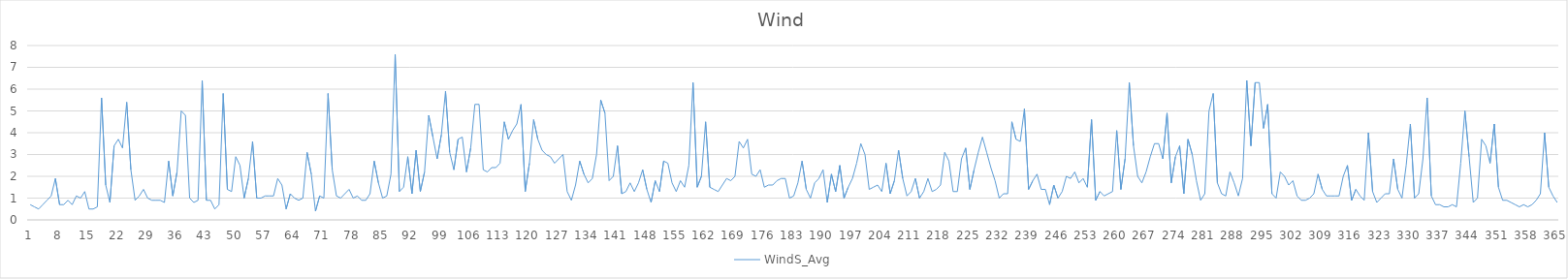
| Category | WindS_Avg |
|---|---|
| 0 | 0.7 |
| 1 | 0.6 |
| 2 | 0.5 |
| 3 | 0.7 |
| 4 | 0.9 |
| 5 | 1.1 |
| 6 | 1.9 |
| 7 | 0.7 |
| 8 | 0.7 |
| 9 | 0.9 |
| 10 | 0.7 |
| 11 | 1.1 |
| 12 | 1 |
| 13 | 1.3 |
| 14 | 0.5 |
| 15 | 0.5 |
| 16 | 0.6 |
| 17 | 5.6 |
| 18 | 1.6 |
| 19 | 0.8 |
| 20 | 3.4 |
| 21 | 3.7 |
| 22 | 3.3 |
| 23 | 5.4 |
| 24 | 2.3 |
| 25 | 0.9 |
| 26 | 1.1 |
| 27 | 1.4 |
| 28 | 1 |
| 29 | 0.9 |
| 30 | 0.9 |
| 31 | 0.9 |
| 32 | 0.8 |
| 33 | 2.7 |
| 34 | 1.1 |
| 35 | 2.2 |
| 36 | 5 |
| 37 | 4.8 |
| 38 | 1 |
| 39 | 0.8 |
| 40 | 0.9 |
| 41 | 6.4 |
| 42 | 0.9 |
| 43 | 0.9 |
| 44 | 0.5 |
| 45 | 0.7 |
| 46 | 5.8 |
| 47 | 1.4 |
| 48 | 1.3 |
| 49 | 2.9 |
| 50 | 2.5 |
| 51 | 1 |
| 52 | 1.9 |
| 53 | 3.6 |
| 54 | 1 |
| 55 | 1 |
| 56 | 1.1 |
| 57 | 1.1 |
| 58 | 1.1 |
| 59 | 1.9 |
| 60 | 1.6 |
| 61 | 0.5 |
| 62 | 1.2 |
| 63 | 1 |
| 64 | 0.9 |
| 65 | 1 |
| 66 | 3.1 |
| 67 | 2.1 |
| 68 | 0.4 |
| 69 | 1.1 |
| 70 | 1 |
| 71 | 5.8 |
| 72 | 2.3 |
| 73 | 1.1 |
| 74 | 1 |
| 75 | 1.2 |
| 76 | 1.4 |
| 77 | 1 |
| 78 | 1.1 |
| 79 | 0.9 |
| 80 | 0.9 |
| 81 | 1.2 |
| 82 | 2.7 |
| 83 | 1.7 |
| 84 | 1 |
| 85 | 1.1 |
| 86 | 2.1 |
| 87 | 7.6 |
| 88 | 1.3 |
| 89 | 1.5 |
| 90 | 2.9 |
| 91 | 1.2 |
| 92 | 3.2 |
| 93 | 1.3 |
| 94 | 2.2 |
| 95 | 4.8 |
| 96 | 3.8 |
| 97 | 2.8 |
| 98 | 3.9 |
| 99 | 5.9 |
| 100 | 3.1 |
| 101 | 2.3 |
| 102 | 3.7 |
| 103 | 3.8 |
| 104 | 2.2 |
| 105 | 3.3 |
| 106 | 5.3 |
| 107 | 5.3 |
| 108 | 2.3 |
| 109 | 2.2 |
| 110 | 2.4 |
| 111 | 2.4 |
| 112 | 2.6 |
| 113 | 4.5 |
| 114 | 3.7 |
| 115 | 4.1 |
| 116 | 4.4 |
| 117 | 5.3 |
| 118 | 1.3 |
| 119 | 2.6 |
| 120 | 4.6 |
| 121 | 3.7 |
| 122 | 3.2 |
| 123 | 3 |
| 124 | 2.9 |
| 125 | 2.6 |
| 126 | 2.8 |
| 127 | 3 |
| 128 | 1.3 |
| 129 | 0.9 |
| 130 | 1.6 |
| 131 | 2.7 |
| 132 | 2.1 |
| 133 | 1.7 |
| 134 | 1.9 |
| 135 | 3 |
| 136 | 5.5 |
| 137 | 4.9 |
| 138 | 1.8 |
| 139 | 2 |
| 140 | 3.4 |
| 141 | 1.2 |
| 142 | 1.3 |
| 143 | 1.7 |
| 144 | 1.3 |
| 145 | 1.7 |
| 146 | 2.3 |
| 147 | 1.4 |
| 148 | 0.8 |
| 149 | 1.8 |
| 150 | 1.3 |
| 151 | 2.7 |
| 152 | 2.6 |
| 153 | 1.7 |
| 154 | 1.3 |
| 155 | 1.8 |
| 156 | 1.5 |
| 157 | 2.5 |
| 158 | 6.3 |
| 159 | 1.5 |
| 160 | 2 |
| 161 | 4.5 |
| 162 | 1.5 |
| 163 | 1.4 |
| 164 | 1.3 |
| 165 | 1.6 |
| 166 | 1.9 |
| 167 | 1.8 |
| 168 | 2 |
| 169 | 3.6 |
| 170 | 3.3 |
| 171 | 3.7 |
| 172 | 2.1 |
| 173 | 2 |
| 174 | 2.3 |
| 175 | 1.5 |
| 176 | 1.6 |
| 177 | 1.6 |
| 178 | 1.8 |
| 179 | 1.9 |
| 180 | 1.9 |
| 181 | 1 |
| 182 | 1.1 |
| 183 | 1.7 |
| 184 | 2.7 |
| 185 | 1.4 |
| 186 | 1 |
| 187 | 1.7 |
| 188 | 1.9 |
| 189 | 2.3 |
| 190 | 0.8 |
| 191 | 2.1 |
| 192 | 1.3 |
| 193 | 2.5 |
| 194 | 1 |
| 195 | 1.5 |
| 196 | 1.9 |
| 197 | 2.6 |
| 198 | 3.5 |
| 199 | 3 |
| 200 | 1.4 |
| 201 | 1.5 |
| 202 | 1.6 |
| 203 | 1.3 |
| 204 | 2.6 |
| 205 | 1.2 |
| 206 | 1.8 |
| 207 | 3.2 |
| 208 | 1.9 |
| 209 | 1.1 |
| 210 | 1.3 |
| 211 | 1.9 |
| 212 | 1 |
| 213 | 1.3 |
| 214 | 1.9 |
| 215 | 1.3 |
| 216 | 1.4 |
| 217 | 1.6 |
| 218 | 3.1 |
| 219 | 2.7 |
| 220 | 1.3 |
| 221 | 1.3 |
| 222 | 2.8 |
| 223 | 3.3 |
| 224 | 1.4 |
| 225 | 2.3 |
| 226 | 3.1 |
| 227 | 3.8 |
| 228 | 3.1 |
| 229 | 2.4 |
| 230 | 1.8 |
| 231 | 1 |
| 232 | 1.2 |
| 233 | 1.2 |
| 234 | 4.5 |
| 235 | 3.7 |
| 236 | 3.6 |
| 237 | 5.1 |
| 238 | 1.4 |
| 239 | 1.8 |
| 240 | 2.1 |
| 241 | 1.4 |
| 242 | 1.4 |
| 243 | 0.7 |
| 244 | 1.6 |
| 245 | 1 |
| 246 | 1.3 |
| 247 | 2 |
| 248 | 1.9 |
| 249 | 2.2 |
| 250 | 1.7 |
| 251 | 1.9 |
| 252 | 1.5 |
| 253 | 4.6 |
| 254 | 0.9 |
| 255 | 1.3 |
| 256 | 1.1 |
| 257 | 1.2 |
| 258 | 1.3 |
| 259 | 4.1 |
| 260 | 1.4 |
| 261 | 2.8 |
| 262 | 6.3 |
| 263 | 3.4 |
| 264 | 2 |
| 265 | 1.7 |
| 266 | 2.2 |
| 267 | 2.9 |
| 268 | 3.5 |
| 269 | 3.5 |
| 270 | 2.8 |
| 271 | 4.9 |
| 272 | 1.7 |
| 273 | 2.9 |
| 274 | 3.4 |
| 275 | 1.2 |
| 276 | 3.7 |
| 277 | 3 |
| 278 | 1.8 |
| 279 | 0.9 |
| 280 | 1.2 |
| 281 | 5 |
| 282 | 5.8 |
| 283 | 1.7 |
| 284 | 1.2 |
| 285 | 1.1 |
| 286 | 2.2 |
| 287 | 1.7 |
| 288 | 1.1 |
| 289 | 1.9 |
| 290 | 6.4 |
| 291 | 3.4 |
| 292 | 6.3 |
| 293 | 6.3 |
| 294 | 4.2 |
| 295 | 5.3 |
| 296 | 1.2 |
| 297 | 1 |
| 298 | 2.2 |
| 299 | 2 |
| 300 | 1.6 |
| 301 | 1.8 |
| 302 | 1.1 |
| 303 | 0.9 |
| 304 | 0.9 |
| 305 | 1 |
| 306 | 1.2 |
| 307 | 2.1 |
| 308 | 1.4 |
| 309 | 1.1 |
| 310 | 1.1 |
| 311 | 1.1 |
| 312 | 1.1 |
| 313 | 2 |
| 314 | 2.5 |
| 315 | 0.9 |
| 316 | 1.4 |
| 317 | 1.1 |
| 318 | 0.9 |
| 319 | 4 |
| 320 | 1.3 |
| 321 | 0.8 |
| 322 | 1 |
| 323 | 1.2 |
| 324 | 1.2 |
| 325 | 2.8 |
| 326 | 1.4 |
| 327 | 1 |
| 328 | 2.5 |
| 329 | 4.4 |
| 330 | 1 |
| 331 | 1.2 |
| 332 | 2.8 |
| 333 | 5.6 |
| 334 | 1.1 |
| 335 | 0.7 |
| 336 | 0.7 |
| 337 | 0.6 |
| 338 | 0.6 |
| 339 | 0.7 |
| 340 | 0.6 |
| 341 | 2.6 |
| 342 | 5 |
| 343 | 2.9 |
| 344 | 0.8 |
| 345 | 1 |
| 346 | 3.7 |
| 347 | 3.4 |
| 348 | 2.6 |
| 349 | 4.4 |
| 350 | 1.5 |
| 351 | 0.9 |
| 352 | 0.9 |
| 353 | 0.8 |
| 354 | 0.7 |
| 355 | 0.6 |
| 356 | 0.7 |
| 357 | 0.6 |
| 358 | 0.7 |
| 359 | 0.9 |
| 360 | 1.2 |
| 361 | 4 |
| 362 | 1.5 |
| 363 | 1.1 |
| 364 | 0.8 |